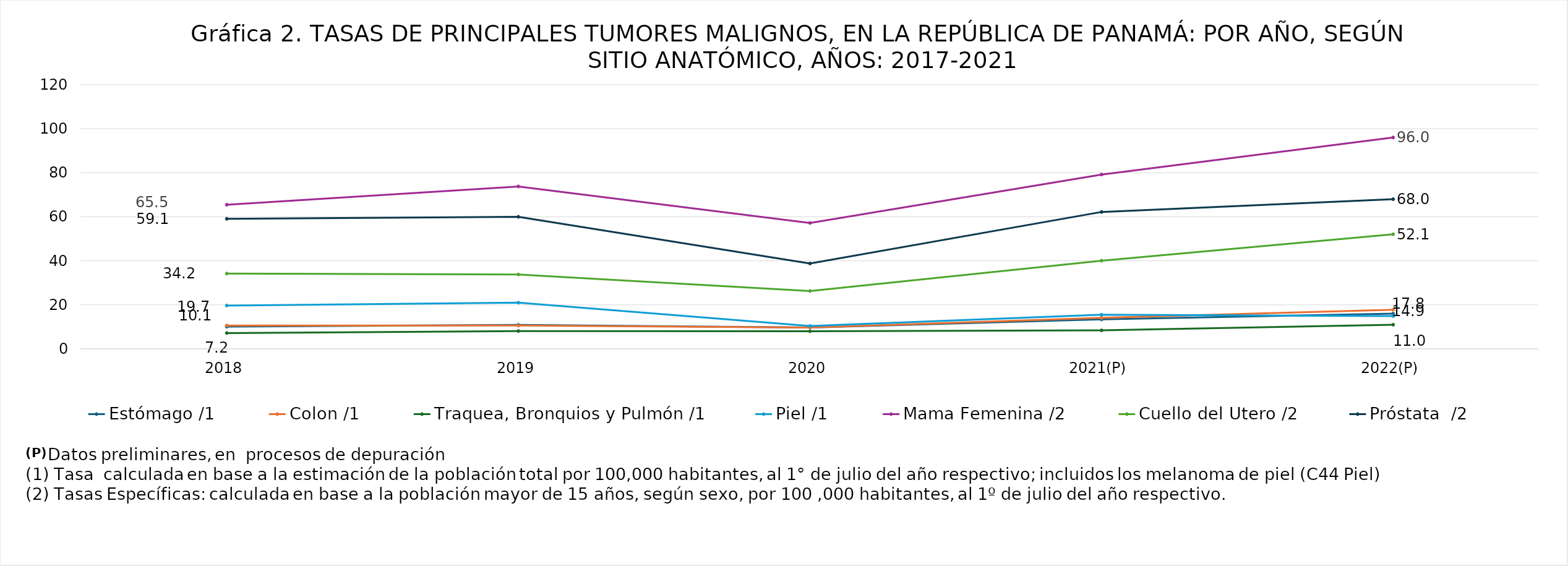
| Category | Estómago /1 | Colon /1 | Traquea, Bronquios y Pulmón /1 | Piel /1 | Mama Femenina /2 | Cuello del Utero /2 | Próstata  /2 |
|---|---|---|---|---|---|---|---|
| 2018 | 10.1 | 10.6 | 7.2 | 19.7 | 65.5 | 34.2 | 59.1 |
| 2019 | 10.9 | 10.6 | 8.1 | 21 | 73.8 | 33.8 | 60 |
| 2020 | 9.7 | 9.7 | 8 | 10.4 | 57.2 | 26.29 | 38.8 |
| 2021(P) | 13.4 | 14.1 | 8.4 | 15.5 | 79.2 | 40.07 | 62.21 |
| 2022(P) | 16 | 17.8 | 10.98 | 14.9 | 96.03 | 52.09 | 68.01 |